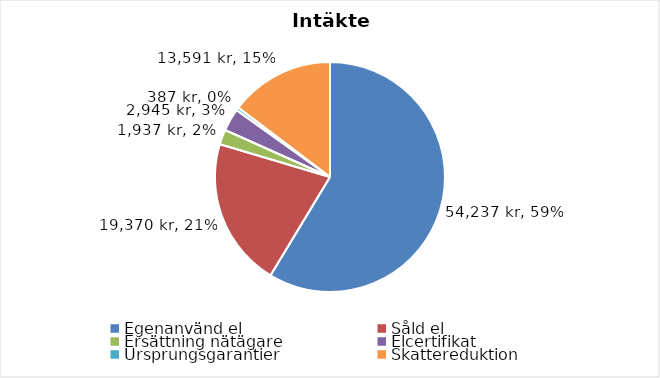
| Category | Series 0 |
|---|---|
| Egenanvänd el | 54236.747 |
| Såld el | 19370.267 |
| Ersättning nätägare | 1937.027 |
| Elcertifikat | 2944.718 |
| Ursprungsgarantier | 387.405 |
| Skattereduktion | 13591.007 |